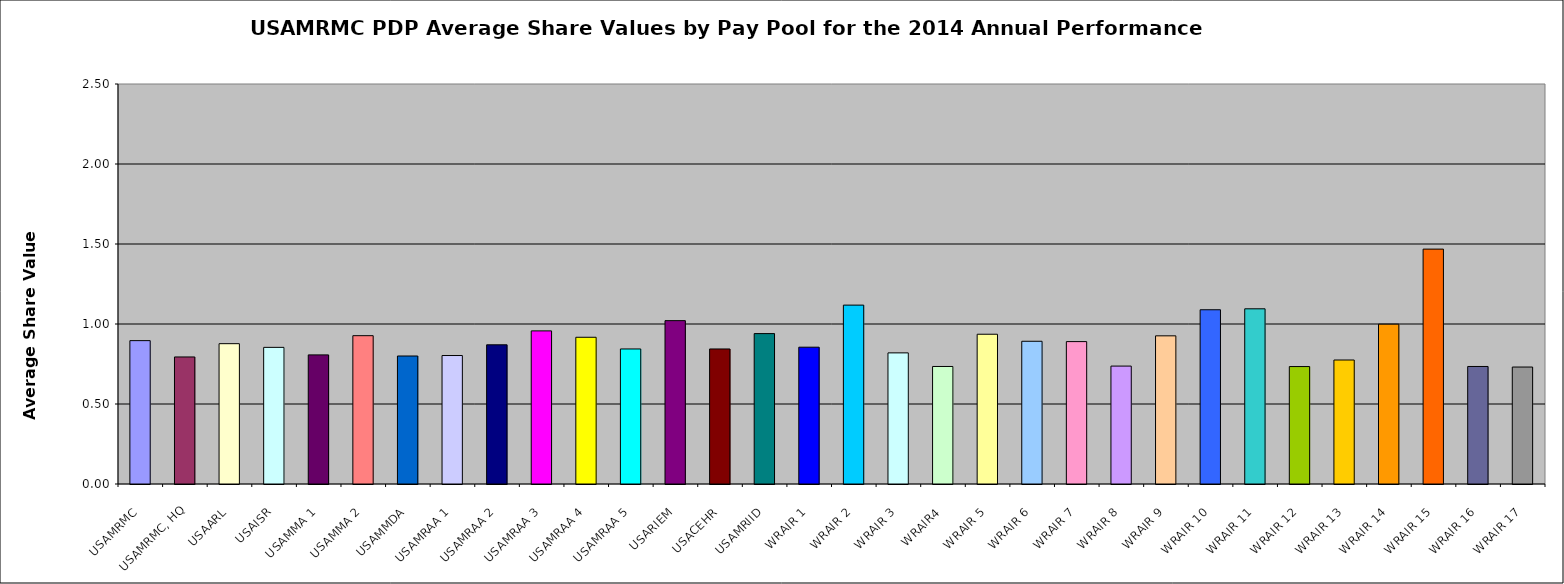
| Category | Series 0 |
|---|---|
| USAMRMC | 0.896 |
| USAMRMC, HQ | 0.794 |
| USAARL | 0.877 |
| USAISR | 0.854 |
| USAMMA 1 | 0.807 |
| USAMMA 2 | 0.927 |
| USAMMDA | 0.8 |
| USAMRAA 1 | 0.803 |
| USAMRAA 2 | 0.87 |
| USAMRAA 3 | 0.957 |
| USAMRAA 4 | 0.917 |
| USAMRAA 5 | 0.844 |
| USARIEM | 1.021 |
| USACEHR | 0.844 |
| USAMRIID | 0.94 |
| WRAIR 1 | 0.855 |
| WRAIR 2 | 1.118 |
| WRAIR 3 | 0.82 |
| WRAIR4 | 0.734 |
| WRAIR 5 | 0.936 |
| WRAIR 6 | 0.892 |
| WRAIR 7 | 0.89 |
| WRAIR 8 | 0.737 |
| WRAIR 9 | 0.926 |
| WRAIR 10 | 1.089 |
| WRAIR 11 | 1.095 |
| WRAIR 12 | 0.734 |
| WRAIR 13 | 0.775 |
| WRAIR 14 | 0.999 |
| WRAIR 15 | 1.468 |
| WRAIR 16 | 0.734 |
| WRAIR 17 | 0.731 |